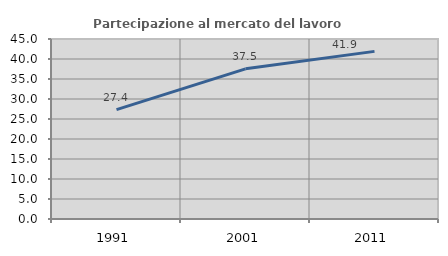
| Category | Partecipazione al mercato del lavoro  femminile |
|---|---|
| 1991.0 | 27.351 |
| 2001.0 | 37.539 |
| 2011.0 | 41.905 |